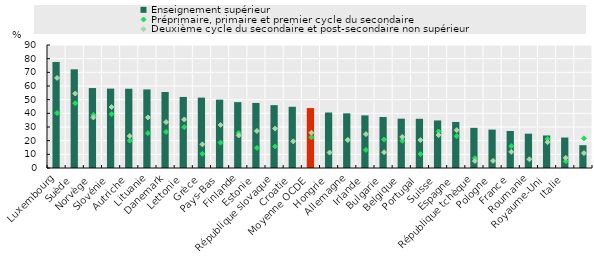
| Category | Enseignement supérieur |
|---|---|
| Luxembourg | 77.6 |
| Suède | 72.2 |
| Norvège | 58.5 |
| Slovénie | 58.1 |
| Autriche | 58 |
| Lituanie | 57.5 |
| Danemark | 55.6 |
| Lettonie | 52 |
| Grèce | 51.5 |
| Pays­Bas | 50 |
| Finlande | 48.2 |
| Estonie | 47.6 |
| République slovaque | 46 |
| Croatie | 44.8 |
| Moyenne OCDE | 43.842 |
| Hongrie | 40.6 |
| Allemagne | 40 |
| Irlande | 38.5 |
| Bulgarie | 37.3 |
| Belgique | 36.1 |
| Portugal | 36 |
| Suisse | 34.8 |
| Espagne | 33.7 |
| République tchèque | 29.4 |
| Pologne | 28.1 |
| France | 27.1 |
| Roumanie | 25.1 |
| Royaume‑Uni | 23.8 |
| Italie | 22.3 |